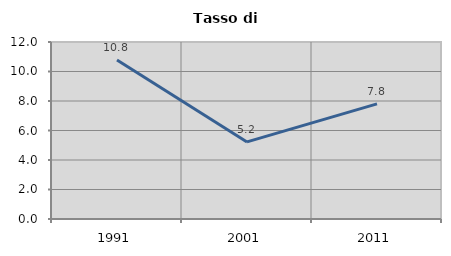
| Category | Tasso di disoccupazione   |
|---|---|
| 1991.0 | 10.783 |
| 2001.0 | 5.226 |
| 2011.0 | 7.802 |